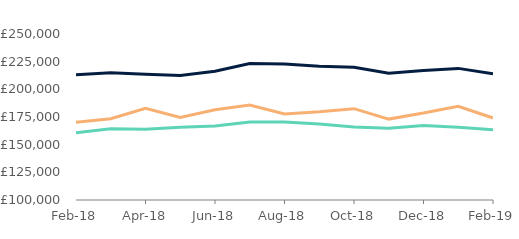
| Category | First-time
buyers | Homemovers | Remortgagors |
|---|---|---|---|
| 2018-02-01 | 160835.905 | 213069.152 | 170301.785 |
| 2018-03-01 | 164414.442 | 214882.893 | 173406.723 |
| 2018-04-01 | 163960.564 | 213698.889 | 182897.23 |
| 2018-05-01 | 165694.921 | 212468.823 | 174591.955 |
| 2018-06-01 | 166803.917 | 216381.686 | 181554.108 |
| 2018-07-01 | 170581.949 | 223339.053 | 185824.089 |
| 2018-08-01 | 170448.464 | 222850.081 | 177824.99 |
| 2018-09-01 | 168586.635 | 220870.685 | 179752.667 |
| 2018-10-01 | 166004.613 | 219865.372 | 182540.816 |
| 2018-11-01 | 164758.396 | 214553.084 | 173109.066 |
| 2018-12-01 | 167335.691 | 216931.536 | 178528.964 |
| 2019-01-01 | 165787.755 | 218925.037 | 184669.155 |
| 2019-02-01 | 163506.797 | 214061.736 | 174137.542 |